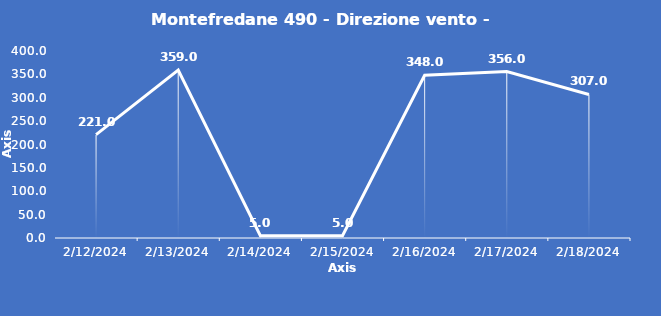
| Category | Montefredane 490 - Direzione vento - Grezzo (°N) |
|---|---|
| 2/12/24 | 221 |
| 2/13/24 | 359 |
| 2/14/24 | 5 |
| 2/15/24 | 5 |
| 2/16/24 | 348 |
| 2/17/24 | 356 |
| 2/18/24 | 307 |